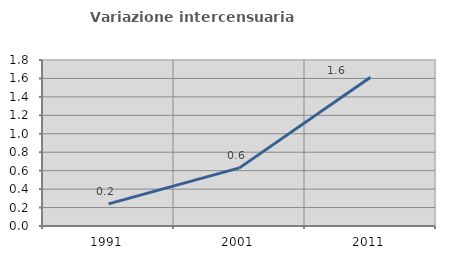
| Category | Variazione intercensuaria annua |
|---|---|
| 1991.0 | 0.24 |
| 2001.0 | 0.63 |
| 2011.0 | 1.614 |